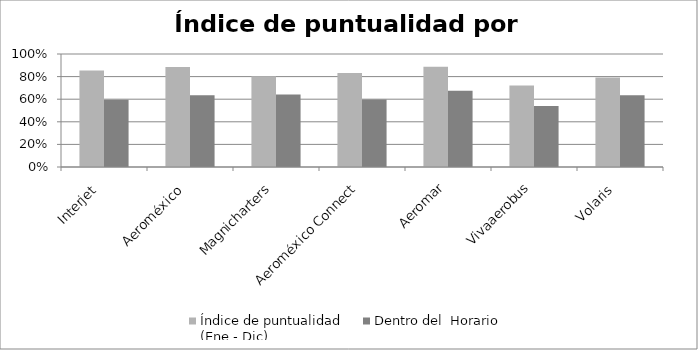
| Category | Índice de puntualidad
(Ene - Dic) | Dentro del  Horario |
|---|---|---|
| Interjet  | 0.854 | 0.596 |
| Aeroméxico  | 0.886 | 0.635 |
| Magnicharters  | 0.803 | 0.641 |
| Aeroméxico Connect  | 0.831 | 0.598 |
| Aeromar | 0.888 | 0.674 |
| Vivaaerobus  | 0.72 | 0.539 |
| Volaris  | 0.791 | 0.636 |